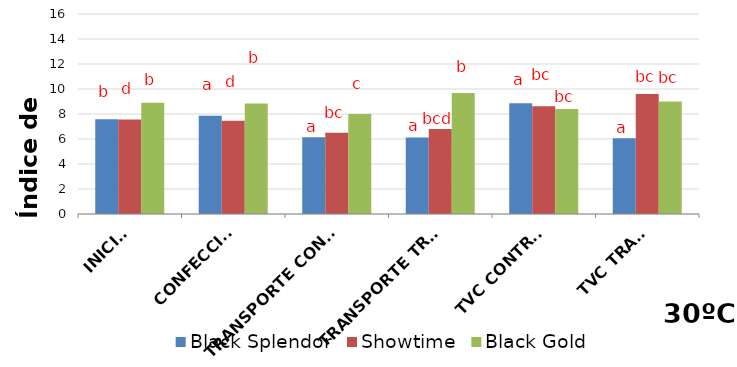
| Category | Black Splendor | Showtime | Black Gold |
|---|---|---|---|
| INICIAL | 7.59 | 7.552 | 8.907 |
| CONFECCIÓN | 7.86 | 7.453 | 8.835 |
| TRANSPORTE CONTROL | 6.144 | 6.497 | 7.992 |
| TRANSPORTE TRAT. | 6.121 | 6.803 | 9.683 |
| TVC CONTROL | 8.85 | 8.628 | 8.392 |
| TVC TRAT. | 6.065 | 9.601 | 9.002 |